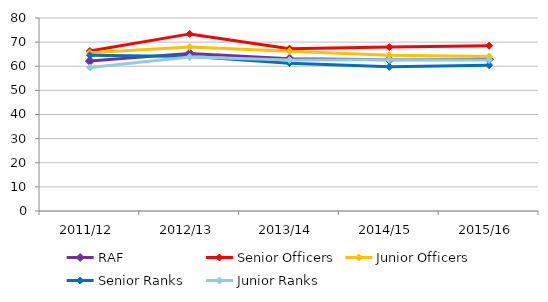
| Category | RAF | Senior Officers | Junior Officers | Senior Ranks | Junior Ranks |
|---|---|---|---|---|---|
| 2011/12 | 62.163 | 66.346 | 65.576 | 64.58 | 59.477 |
| 2012/13 | 65.335 | 73.412 | 67.988 | 64.092 | 63.796 |
| 2013/14 | 63.141 | 67.301 | 66.234 | 61.294 | 62.575 |
| 2014/15 | 62.704 | 67.952 | 64.518 | 59.753 | 62.682 |
| 2015/16 | 62.843 | 68.535 | 64.021 | 60.455 | 62.565 |